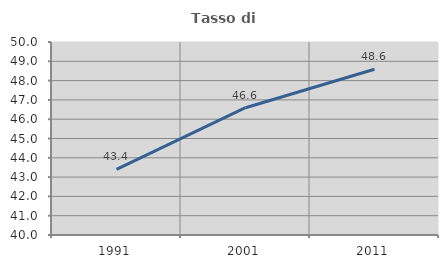
| Category | Tasso di occupazione   |
|---|---|
| 1991.0 | 43.401 |
| 2001.0 | 46.596 |
| 2011.0 | 48.589 |